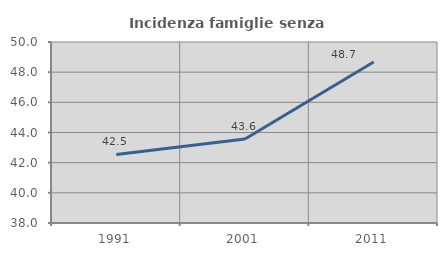
| Category | Incidenza famiglie senza nuclei |
|---|---|
| 1991.0 | 42.546 |
| 2001.0 | 43.569 |
| 2011.0 | 48.678 |